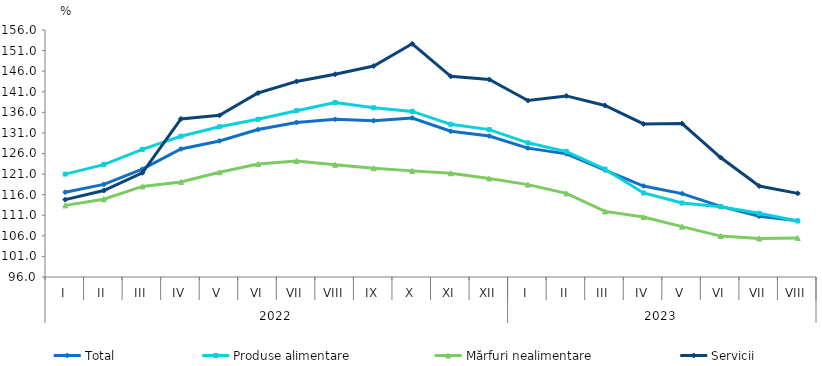
| Category | Total  | Produse alimentare | Mărfuri nealimentare  | Servicii |
|---|---|---|---|---|
| 0 | 116.6 | 121 | 113.4 | 114.8 |
| 1 | 118.5 | 123.3 | 114.9 | 117 |
| 2 | 122.2 | 127 | 118 | 121.3 |
| 3 | 127.1 | 130.2 | 119.1 | 134.4 |
| 4 | 129.047 | 132.5 | 121.45 | 135.267 |
| 5 | 131.827 | 134.301 | 123.443 | 140.701 |
| 6 | 133.547 | 136.399 | 124.168 | 143.511 |
| 7 | 134.294 | 138.387 | 123.256 | 145.253 |
| 8 | 133.971 | 137.121 | 122.424 | 147.248 |
| 9 | 134.625 | 136.226 | 121.779 | 152.646 |
| 10 | 131.406 | 133.093 | 121.201 | 144.742 |
| 11 | 130.241 | 131.801 | 119.936 | 143.965 |
| 12 | 127.307 | 128.59 | 118.441 | 138.865 |
| 13 | 125.91 | 126.47 | 116.31 | 139.99 |
| 14 | 121.977 | 122.19 | 111.932 | 137.666 |
| 15 | 118.102 | 116.414 | 110.554 | 133.178 |
| 16 | 116.262 | 113.97 | 108.228 | 133.268 |
| 17 | 113.152 | 113.076 | 105.931 | 125.017 |
| 18 | 110.755 | 111.48 | 105.365 | 118.101 |
| 19 | 109.689 | 109.605 | 105.486 | 116.313 |